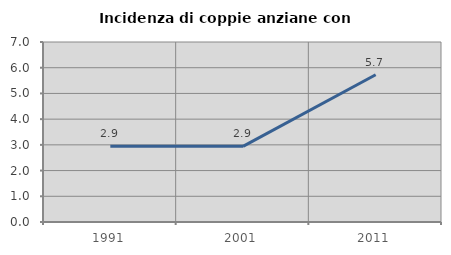
| Category | Incidenza di coppie anziane con figli |
|---|---|
| 1991.0 | 2.941 |
| 2001.0 | 2.941 |
| 2011.0 | 5.725 |